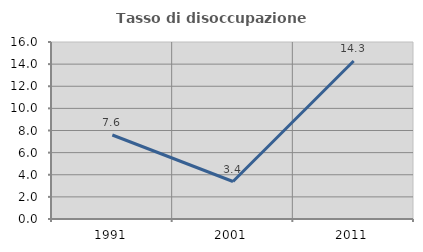
| Category | Tasso di disoccupazione giovanile  |
|---|---|
| 1991.0 | 7.595 |
| 2001.0 | 3.39 |
| 2011.0 | 14.286 |